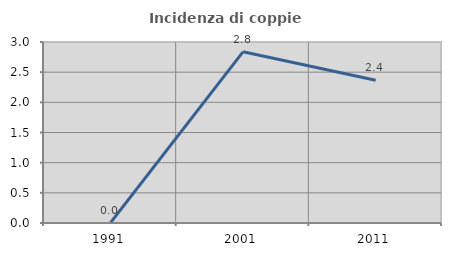
| Category | Incidenza di coppie miste |
|---|---|
| 1991.0 | 0 |
| 2001.0 | 2.837 |
| 2011.0 | 2.367 |